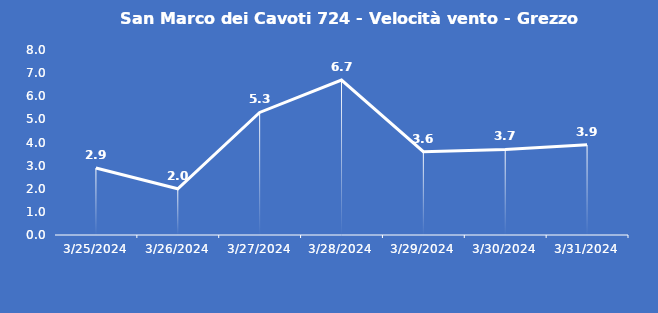
| Category | San Marco dei Cavoti 724 - Velocità vento - Grezzo (m/s) |
|---|---|
| 3/25/24 | 2.9 |
| 3/26/24 | 2 |
| 3/27/24 | 5.3 |
| 3/28/24 | 6.7 |
| 3/29/24 | 3.6 |
| 3/30/24 | 3.7 |
| 3/31/24 | 3.9 |